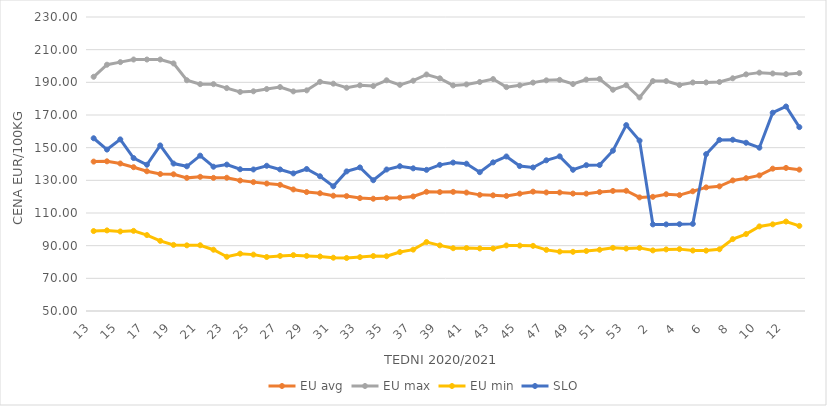
| Category | EU avg | EU max | EU min | SLO |
|---|---|---|---|---|
| 13.0 | 141.466 | 193.4 | 98.945 | 155.76 |
| 14.0 | 141.645 | 200.79 | 99.347 | 148.84 |
| 15.0 | 140.306 | 202.38 | 98.696 | 155.07 |
| 16.0 | 138.046 | 203.97 | 99.065 | 143.65 |
| 17.0 | 135.556 | 203.97 | 96.499 | 139.55 |
| 18.0 | 133.857 | 203.97 | 92.931 | 151.36 |
| 19.0 | 133.702 | 201.59 | 90.48 | 140.27 |
| 20.0 | 131.51 | 191.27 | 90.199 | 138.59 |
| 21.0 | 132.157 | 188.89 | 90.255 | 145.12 |
| 22.0 | 131.509 | 188.89 | 87.513 | 138.33 |
| 23.0 | 131.578 | 186.47 | 83.199 | 139.64 |
| 24.0 | 129.861 | 184.13 | 85.09 | 136.79 |
| 25.0 | 128.899 | 184.51 | 84.52 | 136.65 |
| 26.0 | 128.034 | 185.91 | 83.06 | 138.92 |
| 27.0 | 127.242 | 187.11 | 83.73 | 136.67 |
| 28.0 | 124.426 | 184.46 | 84.2 | 134.25 |
| 29.0 | 122.822 | 185.09 | 83.72 | 136.94 |
| 30.0 | 122.086 | 190.31 | 83.4 | 132.48 |
| 31.0 | 120.581 | 189.19 | 82.63 | 126.34 |
| 32.0 | 120.341 | 186.67 | 82.46 | 135.48 |
| 33.0 | 119.127 | 188.18 | 82.99 | 137.89 |
| 34.0 | 118.75 | 187.74 | 83.66 | 130.07 |
| 35.0 | 119.136 | 191.25 | 83.53 | 136.63 |
| 36.0 | 119.398 | 188.47 | 86.09 | 138.64 |
| 37.0 | 120.135 | 190.99 | 87.57 | 137.35 |
| 38.0 | 122.982 | 194.8 | 92.21 | 136.42 |
| 39.0 | 122.832 | 192.45 | 90.16 | 139.46 |
| 40.0 | 122.936 | 188.11 | 88.45 | 140.87 |
| 41.0 | 122.507 | 188.73 | 88.54 | 140.18 |
| 42.0 | 121.098 | 190.2 | 88.3 | 134.98 |
| 43.0 | 120.822 | 191.99 | 88.22 | 141 |
| 44.0 | 120.448 | 187.06 | 90.13 | 144.61 |
| 45.0 | 121.843 | 188.15 | 90.04 | 138.73 |
| 46.0 | 123.07 | 189.82 | 89.89 | 137.88 |
| 47.0 | 122.58 | 191.22 | 87.43 | 142.27 |
| 48.0 | 122.553 | 191.52 | 86.35 | 144.69 |
| 49.0 | 121.893 | 188.97 | 86.24 | 136.47 |
| 50.0 | 121.851 | 191.67 | 86.72 | 139.29 |
| 51.0 | 122.8 | 192.06 | 87.5 | 139.35 |
| 52.0 | 123.52 | 185.468 | 88.67 | 148.16 |
| 53.0 | 123.611 | 188.25 | 88.23 | 163.81 |
| 1.0 | 119.553 | 180.72 | 88.64 | 154.31 |
| 2.0 | 119.893 | 190.77 | 87.1 | 103.02 |
| 3.0 | 121.489 | 190.76 | 87.7 | 103.03 |
| 4.0 | 120.954 | 188.33 | 87.88 | 103.15 |
| 5.0 | 123.293 | 189.91 | 87.04 | 103.34 |
| 6.0 | 125.679 | 189.94 | 86.97 | 146.03 |
| 7.0 | 126.326 | 190.21 | 87.79 | 154.77 |
| 8.0 | 129.933 | 192.48 | 94.02 | 154.86 |
| 9.0 | 131.295 | 194.884 | 97.12 | 153 |
| 10.0 | 133.026 | 195.94 | 101.79 | 149.98 |
| 11.0 | 137.152 | 195.419 | 103.05 | 171.4 |
| 12.0 | 137.599 | 195.013 | 104.76 | 175.2 |
| 13.0 | 136.546 | 195.64 | 102.11 | 162.57 |